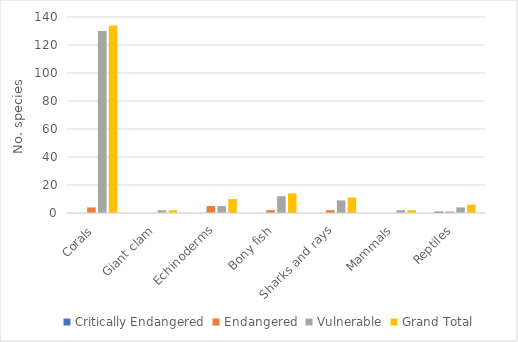
| Category | Critically Endangered | Endangered | Vulnerable | Grand Total |
|---|---|---|---|---|
| Corals | 0 | 4 | 130 | 134 |
| Giant clam | 0 | 0 | 2 | 2 |
| Echinoderms | 0 | 5 | 5 | 10 |
| Bony fish | 0 | 2 | 12 | 14 |
| Sharks and rays | 0 | 2 | 9 | 11 |
| Mammals | 0 | 0 | 2 | 2 |
| Reptiles | 1 | 1 | 4 | 6 |